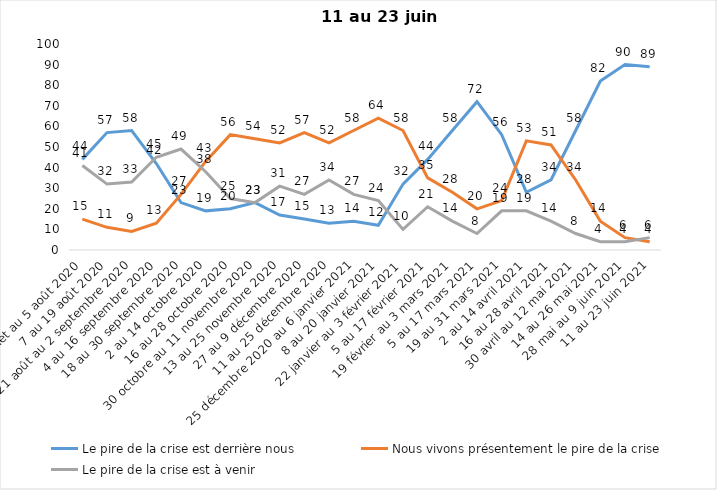
| Category | Le pire de la crise est derrière nous | Nous vivons présentement le pire de la crise | Le pire de la crise est à venir |
|---|---|---|---|
| 24 juillet au 5 août 2020 | 44 | 15 | 41 |
| 7 au 19 août 2020 | 57 | 11 | 32 |
| 21 août au 2 septembre 2020 | 58 | 9 | 33 |
| 4 au 16 septembre 2020 | 42 | 13 | 45 |
| 18 au 30 septembre 2020 | 23 | 27 | 49 |
| 2 au 14 octobre 2020 | 19 | 43 | 38 |
| 16 au 28 octobre 2020 | 20 | 56 | 25 |
| 30 octobre au 11 novembre 2020 | 23 | 54 | 23 |
| 13 au 25 novembre 2020 | 17 | 52 | 31 |
| 27 au 9 décembre 2020 | 15 | 57 | 27 |
| 11 au 25 décembre 2020 | 13 | 52 | 34 |
| 25 décembre 2020 au 6 janvier 2021 | 14 | 58 | 27 |
| 8 au 20 janvier 2021 | 12 | 64 | 24 |
| 22 janvier au 3 février 2021 | 32 | 58 | 10 |
| 5 au 17 février 2021 | 44 | 35 | 21 |
| 19 février au 3 mars 2021 | 58 | 28 | 14 |
| 5 au 17 mars 2021 | 72 | 20 | 8 |
| 19 au 31 mars 2021 | 56 | 24 | 19 |
| 2 au 14 avril 2021 | 28 | 53 | 19 |
| 16 au 28 avril 2021 | 34 | 51 | 14 |
| 30 avril au 12 mai 2021 | 58 | 34 | 8 |
| 14 au 26 mai 2021 | 82 | 14 | 4 |
| 28 mai au 9 juin 2021 | 90 | 6 | 4 |
| 11 au 23 juin 2021 | 89 | 4 | 6 |